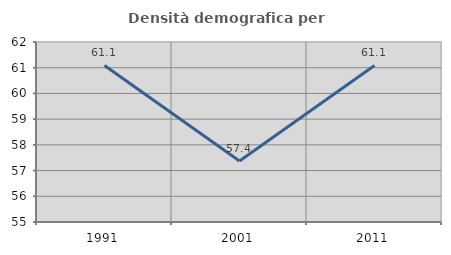
| Category | Densità demografica |
|---|---|
| 1991.0 | 61.088 |
| 2001.0 | 57.37 |
| 2011.0 | 61.088 |